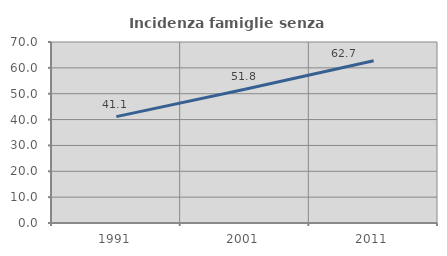
| Category | Incidenza famiglie senza nuclei |
|---|---|
| 1991.0 | 41.132 |
| 2001.0 | 51.759 |
| 2011.0 | 62.732 |